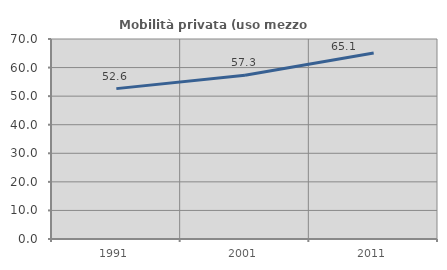
| Category | Mobilità privata (uso mezzo privato) |
|---|---|
| 1991.0 | 52.632 |
| 2001.0 | 57.341 |
| 2011.0 | 65.09 |